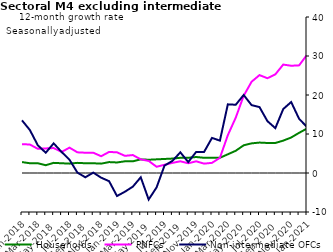
| Category | zero | Households | PNFCs | Non-intermediate OFCs |
|---|---|---|---|---|
| Jan-2018 | 0 | 2.8 | 7.4 | 13.5 |
| Feb-2018 | 0 | 2.5 | 7.3 | 11 |
| Mar-2018 | 0 | 2.5 | 6.2 | 7.1 |
| Apr-2018 | 0 | 2 | 6.3 | 5.2 |
| May-2018 | 0 | 2.6 | 6.4 | 7.6 |
| Jun-2018 | 0 | 2.5 | 5.4 | 5.4 |
| Jul-2018 | 0 | 2.4 | 6.5 | 3.4 |
| Aug-2018 | 0 | 2.6 | 5.3 | 0.1 |
| Sep-2018 | 0 | 2.5 | 5.2 | -1.1 |
| Oct-2018 | 0 | 2.5 | 5.2 | 0.1 |
| Nov-2018 | 0 | 2.4 | 4.3 | -1.2 |
| Dec-2018 | 0 | 2.8 | 5.4 | -2.1 |
| Jan-2019 | 0 | 2.7 | 5.3 | -5.9 |
| Feb-2019 | 0 | 3 | 4.4 | -4.8 |
| Mar-2019 | 0 | 3 | 4.6 | -3.5 |
| Apr-2019 | 0 | 3.5 | 3.5 | -1.1 |
| May-2019 | 0 | 3.4 | 3.1 | -6.8 |
| Jun-2019 | 0 | 3.5 | 1.6 | -3.7 |
| Jul-2019 | 0 | 3.6 | 2.1 | 1.9 |
| Aug-2019 | 0 | 3.7 | 2.6 | 3.1 |
| Sep-2019 | 0 | 3.9 | 3 | 5.3 |
| Oct-2019 | 0 | 3.9 | 2.5 | 2.8 |
| Nov-2019 | 0 | 4.1 | 3 | 5.4 |
| Dec-2019 | 0 | 3.9 | 2.4 | 5.4 |
| Jan-2020 | 0 | 3.9 | 2.6 | 9 |
| Feb-2020 | 0 | 3.9 | 3.9 | 8.3 |
| Mar-2020 | 0 | 4.8 | 9.7 | 17.6 |
| Apr-2020 | 0 | 5.7 | 14.2 | 17.5 |
| May-2020 | 0 | 7.1 | 19.8 | 20 |
| Jun-2020 | 0 | 7.6 | 23.4 | 17.4 |
| Jul-2020 | 0 | 7.8 | 25.1 | 16.9 |
| Aug-2020 | 0 | 7.7 | 24.3 | 13.3 |
| Sep-2020 | 0 | 7.7 | 25.3 | 11.5 |
| Oct-2020 | 0 | 8.3 | 27.8 | 16.4 |
| Nov-2020 | 0 | 9.1 | 27.5 | 18.2 |
| Dec-2020 | 0 | 10.3 | 27.6 | 13.9 |
| Jan-2021 | 0 | 11.4 | 30.3 | 11.8 |